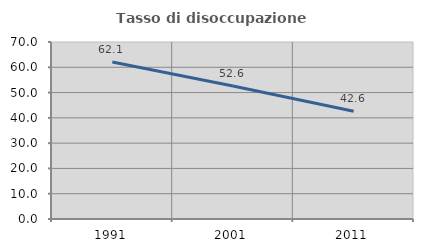
| Category | Tasso di disoccupazione giovanile  |
|---|---|
| 1991.0 | 62.118 |
| 2001.0 | 52.632 |
| 2011.0 | 42.614 |